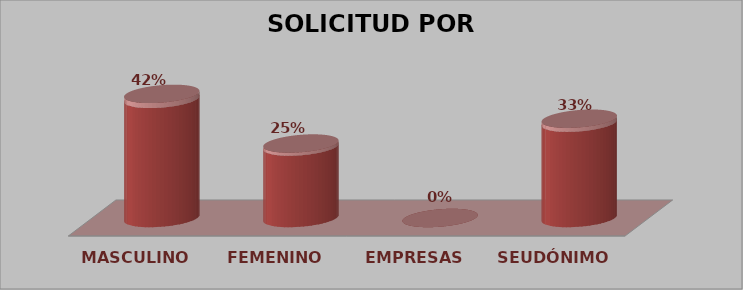
| Category | SOLICITUD POR GÉNERO | Series 1 |
|---|---|---|
| MASCULINO | 10 | 0.417 |
| FEMENINO | 6 | 0.25 |
| EMPRESAS | 0 | 0 |
| SEUDÓNIMO | 8 | 0.333 |